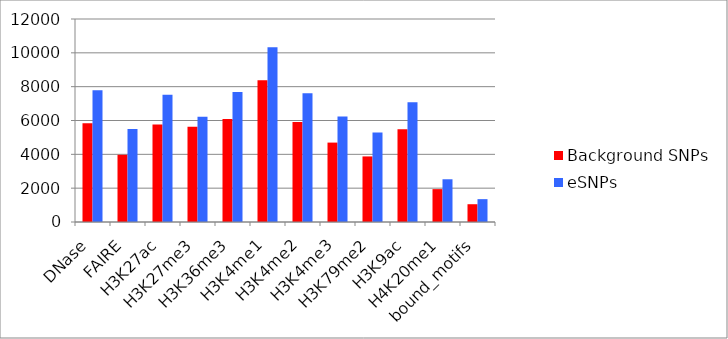
| Category | Background SNPs | eSNPs |
|---|---|---|
| DNase | 5834 | 7783 |
| FAIRE | 3973 | 5499 |
| H3K27ac | 5767 | 7526 |
| H3K27me3 | 5629 | 6225 |
| H3K36me3 | 6093 | 7691 |
| H3K4me1 | 8381 | 10323 |
| H3K4me2 | 5906 | 7606 |
| H3K4me3 | 4694 | 6230 |
| H3K79me2 | 3876 | 5294 |
| H3K9ac | 5482 | 7077 |
| H4K20me1 | 1943 | 2526 |
| bound_motifs | 1051 | 1351 |